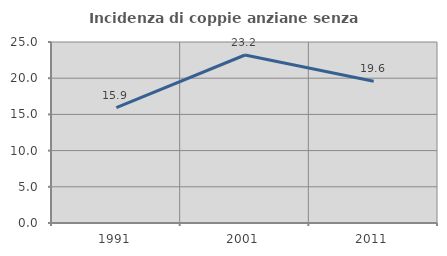
| Category | Incidenza di coppie anziane senza figli  |
|---|---|
| 1991.0 | 15.924 |
| 2001.0 | 23.204 |
| 2011.0 | 19.577 |